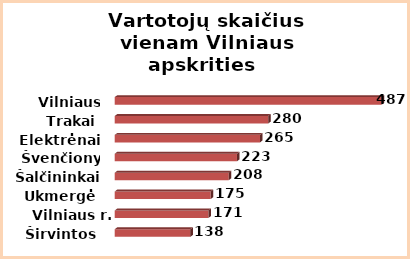
| Category | Series 0 |
|---|---|
| Širvintos | 138 |
| Vilniaus r. | 171 |
| Ukmergė | 175 |
| Šalčininkai | 208 |
| Švenčionys | 223 |
| Elektrėnai | 265 |
| Trakai | 280 |
| Vilniaus m. | 487 |